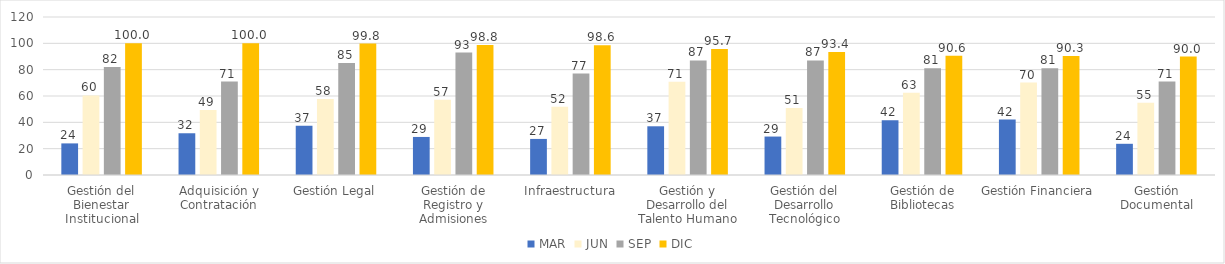
| Category | MAR | JUN | SEP | DIC |
|---|---|---|---|---|
| Gestión del Bienestar Institucional | 24 | 60.4 | 82 | 100 |
| Adquisición y Contratación | 31.7 | 49.4 | 71 | 100 |
| Gestión Legal | 37.4 | 57.8 | 85 | 99.8 |
| Gestión de Registro y Admisiones | 28.9 | 57.1 | 93 | 98.8 |
| Infraestructura | 27.4 | 51.8 | 77 | 98.6 |
| Gestión y Desarrollo del Talento Humano | 37 | 70.9 | 87 | 95.7 |
| Gestión del Desarrollo Tecnológico | 29.2 | 50.9 | 87 | 93.4 |
| Gestión de Bibliotecas | 41.6 | 62.5 | 81 | 90.6 |
| Gestión Financiera | 42.1 | 70.2 | 81 | 90.3 |
| Gestión Documental | 23.7 | 54.8 | 71 | 90 |